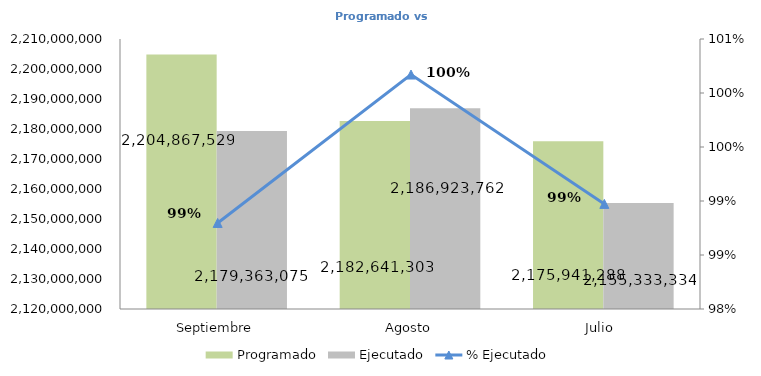
| Category | Programado | Ejecutado |
|---|---|---|
| Septiembre | 2204867529.06 | 2179363075 |
| Agosto | 2182641302.5 | 2186923762 |
| Julio  | 2175941287.69 | 2155333333.69 |